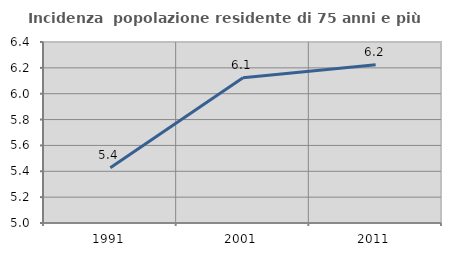
| Category | Incidenza  popolazione residente di 75 anni e più |
|---|---|
| 1991.0 | 5.428 |
| 2001.0 | 6.123 |
| 2011.0 | 6.223 |